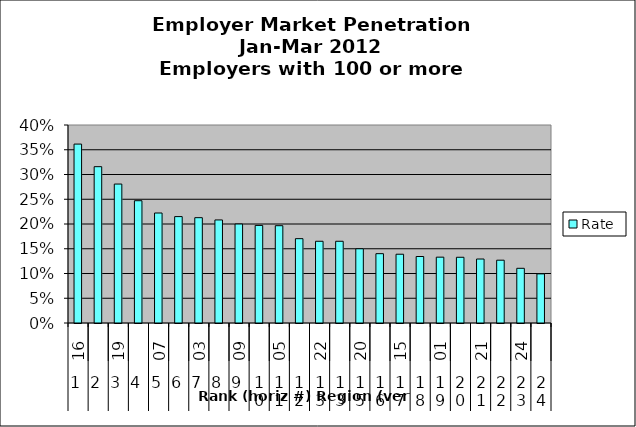
| Category | Rate |
|---|---|
| 0 | 0.361 |
| 1 | 0.316 |
| 2 | 0.281 |
| 3 | 0.247 |
| 4 | 0.222 |
| 5 | 0.215 |
| 6 | 0.213 |
| 7 | 0.208 |
| 8 | 0.2 |
| 9 | 0.197 |
| 10 | 0.197 |
| 11 | 0.17 |
| 12 | 0.165 |
| 13 | 0.165 |
| 14 | 0.15 |
| 15 | 0.14 |
| 16 | 0.139 |
| 17 | 0.134 |
| 18 | 0.133 |
| 19 | 0.133 |
| 20 | 0.129 |
| 21 | 0.127 |
| 22 | 0.11 |
| 23 | 0.099 |